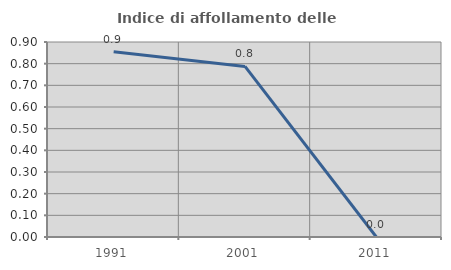
| Category | Indice di affollamento delle abitazioni  |
|---|---|
| 1991.0 | 0.855 |
| 2001.0 | 0.787 |
| 2011.0 | 0 |